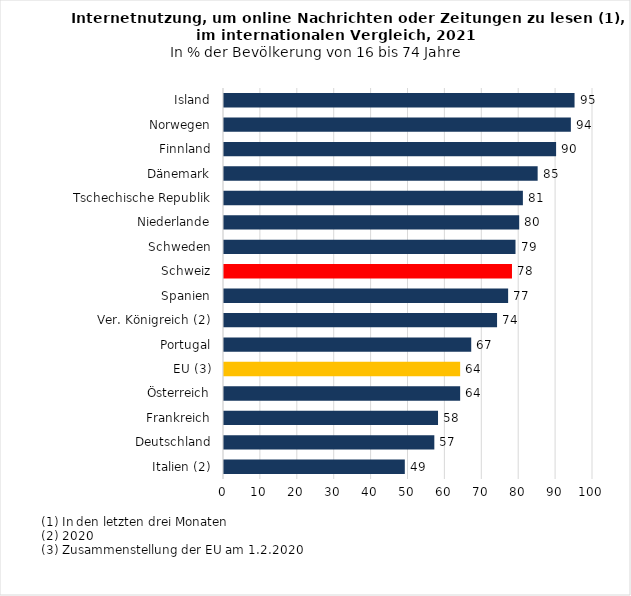
| Category | Series 0 |
|---|---|
| Italien (2) | 49 |
| Deutschland | 57 |
| Frankreich | 58 |
| Österreich | 64 |
| EU (3) | 64 |
| Portugal | 67 |
| Ver. Königreich (2) | 74 |
| Spanien | 77 |
| Schweiz | 78.042 |
| Schweden | 79 |
| Niederlande | 80 |
| Tschechische Republik | 81 |
| Dänemark | 85 |
| Finnland | 90 |
| Norwegen | 94 |
| Island | 95 |